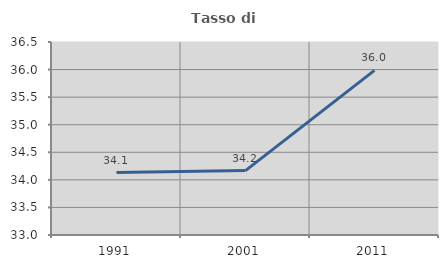
| Category | Tasso di occupazione   |
|---|---|
| 1991.0 | 34.131 |
| 2001.0 | 34.168 |
| 2011.0 | 35.985 |